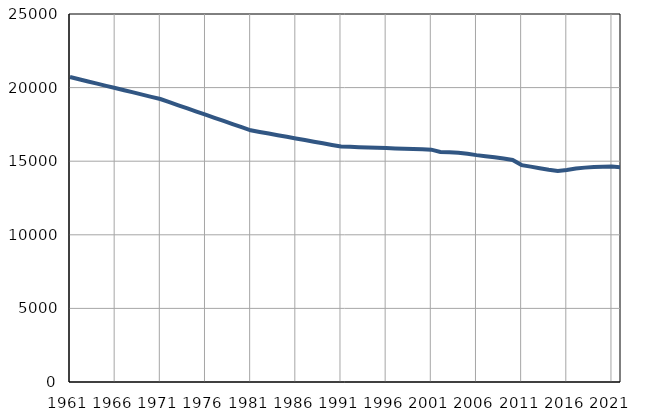
| Category | Population
size |
|---|---|
| 1961.0 | 20716 |
| 1962.0 | 20567 |
| 1963.0 | 20418 |
| 1964.0 | 20268 |
| 1965.0 | 20119 |
| 1966.0 | 19970 |
| 1967.0 | 19821 |
| 1968.0 | 19672 |
| 1969.0 | 19522 |
| 1970.0 | 19373 |
| 1971.0 | 19224 |
| 1972.0 | 19012 |
| 1973.0 | 18799 |
| 1974.0 | 18586 |
| 1975.0 | 18374 |
| 1976.0 | 18160 |
| 1977.0 | 17948 |
| 1978.0 | 17736 |
| 1979.0 | 17523 |
| 1980.0 | 17310 |
| 1981.0 | 17098 |
| 1982.0 | 16988 |
| 1983.0 | 16878 |
| 1984.0 | 16767 |
| 1985.0 | 16657 |
| 1986.0 | 16547 |
| 1987.0 | 16437 |
| 1988.0 | 16327 |
| 1989.0 | 16216 |
| 1990.0 | 16106 |
| 1991.0 | 15996 |
| 1992.0 | 15975 |
| 1993.0 | 15954 |
| 1994.0 | 15933 |
| 1995.0 | 15912 |
| 1996.0 | 15891 |
| 1997.0 | 15870 |
| 1998.0 | 15849 |
| 1999.0 | 15828 |
| 2000.0 | 15807 |
| 2001.0 | 15786 |
| 2002.0 | 15629 |
| 2003.0 | 15600 |
| 2004.0 | 15577 |
| 2005.0 | 15509 |
| 2006.0 | 15412 |
| 2007.0 | 15340 |
| 2008.0 | 15273 |
| 2009.0 | 15189 |
| 2010.0 | 15080 |
| 2011.0 | 14735 |
| 2012.0 | 14632 |
| 2013.0 | 14522 |
| 2014.0 | 14413 |
| 2015.0 | 14343 |
| 2016.0 | 14404 |
| 2017.0 | 14509 |
| 2018.0 | 14564 |
| 2019.0 | 14606 |
| 2020.0 | 14620 |
| 2021.0 | 14636 |
| 2022.0 | 14583 |